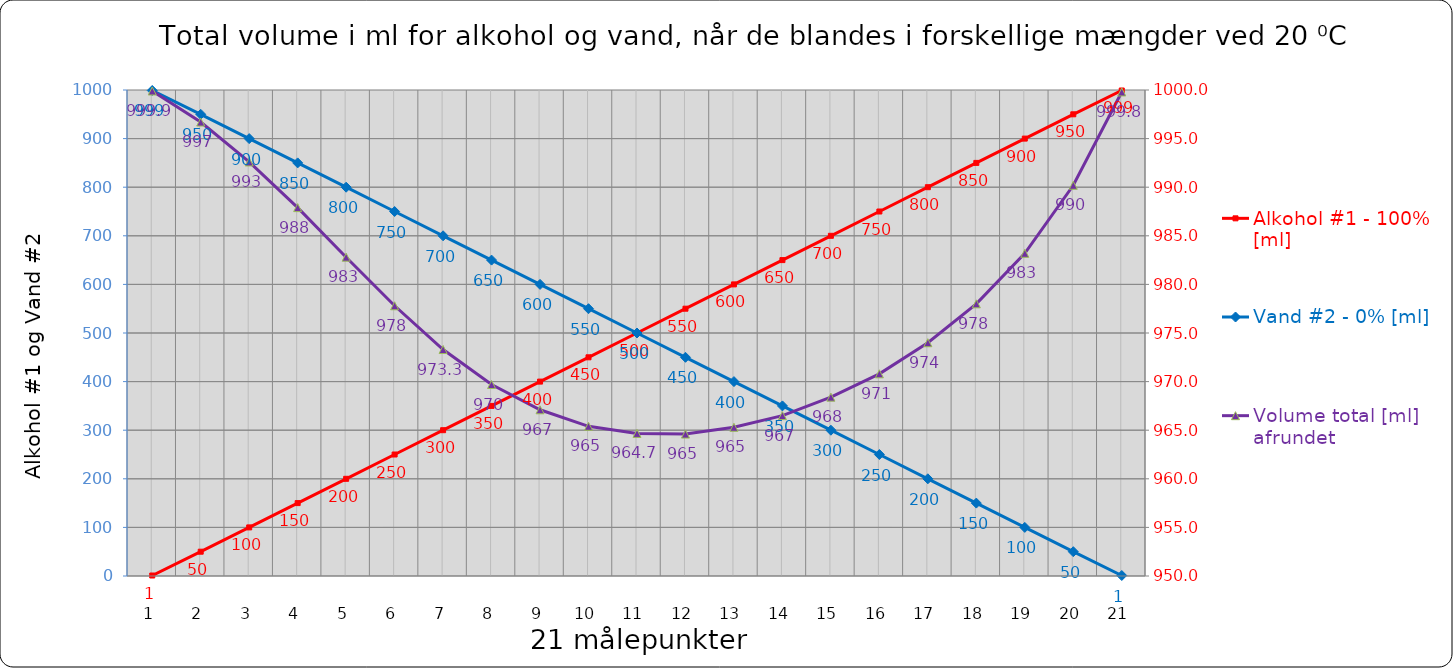
| Category | Alkohol #1 - 100% [ml] | Vand #2 - 0% [ml] |
|---|---|---|
| 0 | 1 | 999 |
| 1 | 50 | 950 |
| 2 | 100 | 900 |
| 3 | 150 | 850 |
| 4 | 200 | 800 |
| 5 | 250 | 750 |
| 6 | 300 | 700 |
| 7 | 350 | 650 |
| 8 | 400 | 600 |
| 9 | 450 | 550 |
| 10 | 500 | 500 |
| 11 | 550 | 450 |
| 12 | 600 | 400 |
| 13 | 650 | 350 |
| 14 | 700 | 300 |
| 15 | 750 | 250 |
| 16 | 800 | 200 |
| 17 | 850 | 150 |
| 18 | 900 | 100 |
| 19 | 950 | 50 |
| 20 | 999 | 1 |